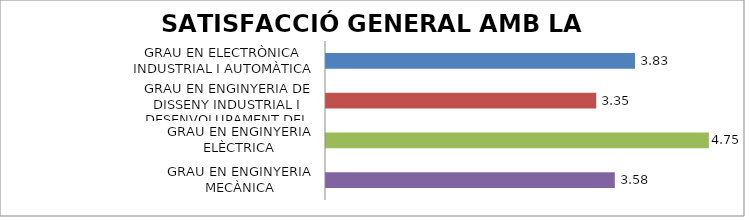
| Category | Series 0 |
|---|---|
| GRAU EN ELECTRÒNICA INDUSTRIAL I AUTOMÀTICA | 3.833 |
| GRAU EN ENGINYERIA DE DISSENY INDUSTRIAL I DESENVOLUPAMENT DEL PRODUCTE | 3.353 |
| GRAU EN ENGINYERIA ELÈCTRICA | 4.75 |
| GRAU EN ENGINYERIA MECÀNICA | 3.583 |